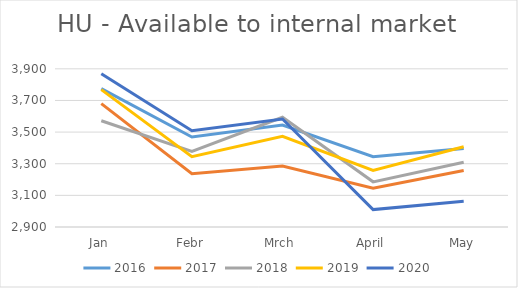
| Category | 2016 | 2017 | 2018 | 2019 | 2020 |
|---|---|---|---|---|---|
| Jan | 3775 | 3680.027 | 3571.442 | 3768.568 | 3869.324 |
| Febr | 3469 | 3237.214 | 3377.766 | 3344.633 | 3508.575 |
| Mrch | 3544 | 3285.658 | 3593.599 | 3472.86 | 3582.64 |
| April | 3344 | 3145.458 | 3185.476 | 3257.101 | 3009.901 |
| May | 3396 | 3257.216 | 3309.029 | 3406.958 | 3063.06 |